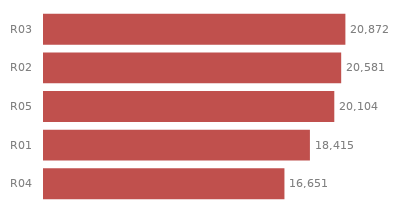
| Category | Total |
|---|---|
| R03 | 20872 |
| R02 | 20581 |
| R05 | 20104 |
| R01 | 18415 |
| R04 | 16651 |